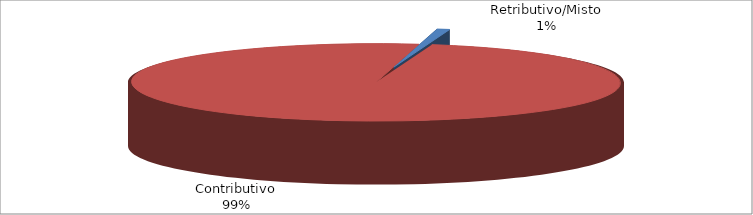
| Category | Decorrenti gennaio - marzo 2020 |
|---|---|
| Retributivo/Misto | 73 |
| Contributivo | 8667 |